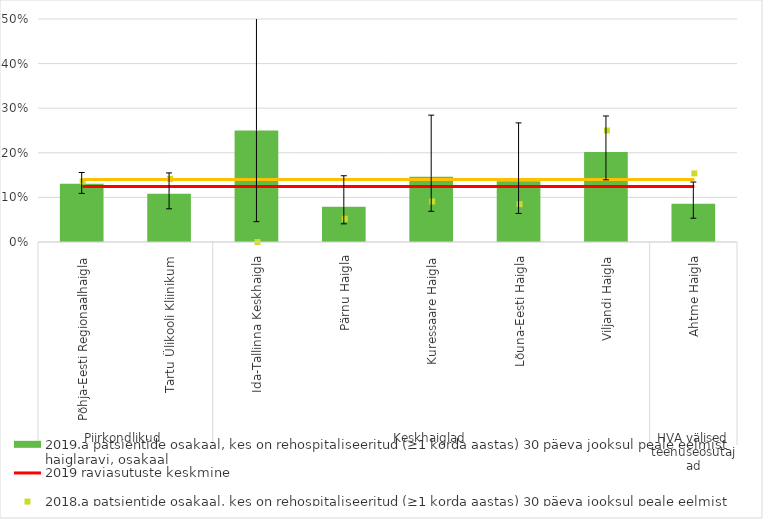
| Category | 2019.a patsientide osakaal, kes on rehospitaliseeritud (≥1 korda aastas) 30 päeva jooksul peale eelmist haiglaravi, osakaal |
|---|---|
| 0 | 0.131 |
| 1 | 0.108 |
| 2 | 0.25 |
| 3 | 0.079 |
| 4 | 0.146 |
| 5 | 0.136 |
| 6 | 0.202 |
| 7 | 0.086 |